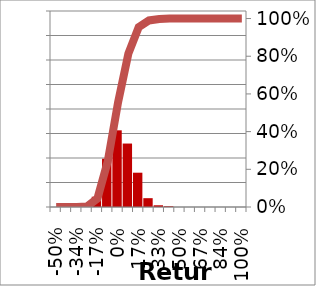
| Category | Series 0 |
|---|---|
| -0.5026891432285294 | 0 |
| -0.41905468606710294 | 0 |
| -0.33542022890567647 | 0 |
| -0.25178577174425 | 0.003 |
| -0.1681513145828235 | 0.042 |
| -0.08451685742139704 | 0.197 |
| -0.0008824002599705782 | 0.313 |
| 0.08275205690145589 | 0.259 |
| 0.16638651406288235 | 0.14 |
| 0.25002097122430883 | 0.036 |
| 0.3336554283857353 | 0.007 |
| 0.4172898855471618 | 0.003 |
| 0.5009243427085882 | 0 |
| 0.5845587998700147 | 0 |
| 0.6681932570314412 | 0 |
| 0.7518277141928676 | 0 |
| 0.8354621713542941 | 0 |
| 0.9190966285157206 | 0 |
| 1.002731085677147 | 0 |